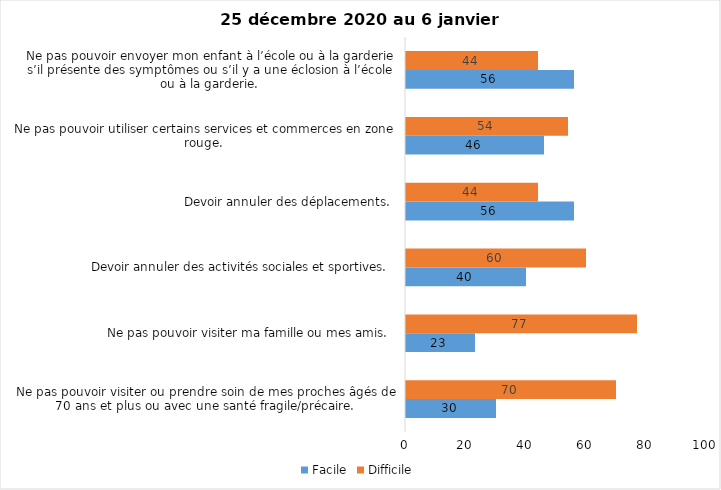
| Category | Facile | Difficile |
|---|---|---|
| Ne pas pouvoir visiter ou prendre soin de mes proches âgés de 70 ans et plus ou avec une santé fragile/précaire.  | 30 | 70 |
| Ne pas pouvoir visiter ma famille ou mes amis.  | 23 | 77 |
| Devoir annuler des activités sociales et sportives.  | 40 | 60 |
| Devoir annuler des déplacements.  | 56 | 44 |
| Ne pas pouvoir utiliser certains services et commerces en zone rouge.  | 46 | 54 |
| Ne pas pouvoir envoyer mon enfant à l’école ou à la garderie s’il présente des symptômes ou s’il y a une éclosion à l’école ou à la garderie.  | 56 | 44 |